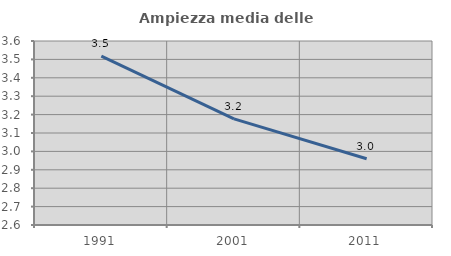
| Category | Ampiezza media delle famiglie |
|---|---|
| 1991.0 | 3.517 |
| 2001.0 | 3.177 |
| 2011.0 | 2.96 |